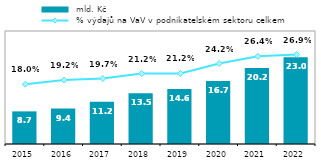
| Category |  mld. Kč |
|---|---|
| 2015 | 8.661 |
| 2016 | 9.421 |
| 2017 | 11.19 |
| 2018 | 13.495 |
| 2019 | 14.6 |
| 2020 | 16.739 |
| 2021 | 20.19 |
| 2022 | 23.035 |